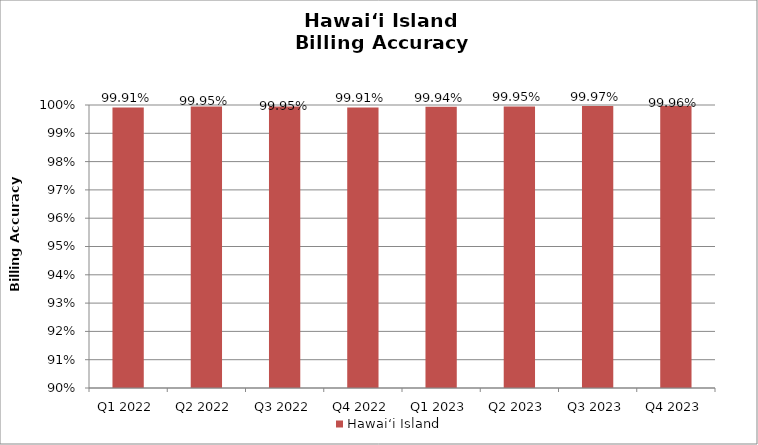
| Category | Hawai‘i Island |
|---|---|
| Q1 2022 | 0.999 |
| Q2 2022 | 0.999 |
| Q3 2022 | 0.999 |
| Q4 2022 | 0.999 |
| Q1 2023 | 0.999 |
| Q2 2023 | 1 |
| Q3 2023 | 1 |
| Q4 2023 | 1 |